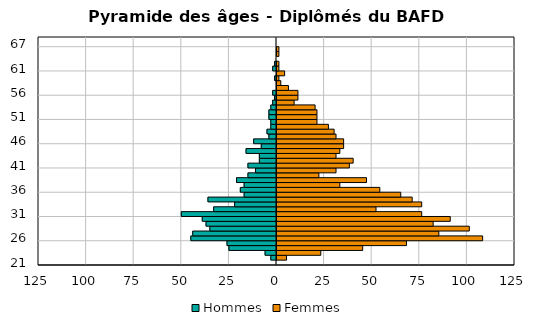
| Category | Hommes | Femmes |
|---|---|---|
| 21.0 | 0 | 0 |
| 22.0 | -3 | 5 |
| 23.0 | -6 | 23 |
| 24.0 | -25 | 45 |
| 25.0 | -26 | 68 |
| 26.0 | -45 | 108 |
| 27.0 | -44 | 85 |
| 28.0 | -35 | 101 |
| 29.0 | -37 | 82 |
| 30.0 | -39 | 91 |
| 31.0 | -50 | 76 |
| 32.0 | -33 | 52 |
| 33.0 | -22 | 76 |
| 34.0 | -36 | 71 |
| 35.0 | -17 | 65 |
| 36.0 | -19 | 54 |
| 37.0 | -17 | 33 |
| 38.0 | -21 | 47 |
| 39.0 | -15 | 22 |
| 40.0 | -11 | 31 |
| 41.0 | -15 | 38 |
| 42.0 | -9 | 40 |
| 43.0 | -9 | 31 |
| 44.0 | -16 | 33 |
| 45.0 | -8 | 35 |
| 46.0 | -12 | 35 |
| 47.0 | -4 | 31 |
| 48.0 | -5 | 30 |
| 49.0 | -3 | 27 |
| 50.0 | -3 | 21 |
| 51.0 | -4 | 21 |
| 52.0 | -4 | 21 |
| 53.0 | -3 | 20 |
| 54.0 | -2 | 9 |
| 55.0 | -1 | 11 |
| 56.0 | -2 | 11 |
| 57.0 | 0 | 6 |
| 58.0 | 0 | 2 |
| 59.0 | -1 | 1 |
| 60.0 | 0 | 4 |
| 61.0 | -2 | 1 |
| 62.0 | -1 | 1 |
| 63.0 | 0 | 0 |
| 64.0 | 0 | 1 |
| 65.0 | 0 | 1 |
| 67.0 | 0 | 0 |
| 69.0 | 0 | 0 |